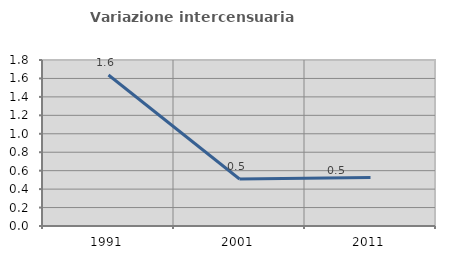
| Category | Variazione intercensuaria annua |
|---|---|
| 1991.0 | 1.638 |
| 2001.0 | 0.509 |
| 2011.0 | 0.525 |